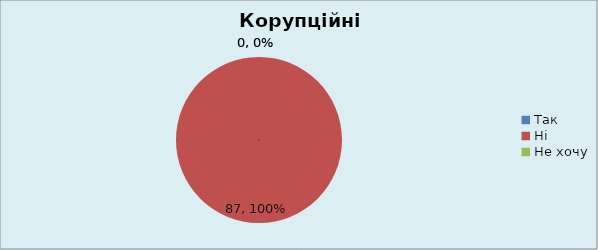
| Category | Кількість | % |
|---|---|---|
| Так | 0 | 0 |
| Ні | 87 | 1 |
| Не хочу | 0 | 0 |